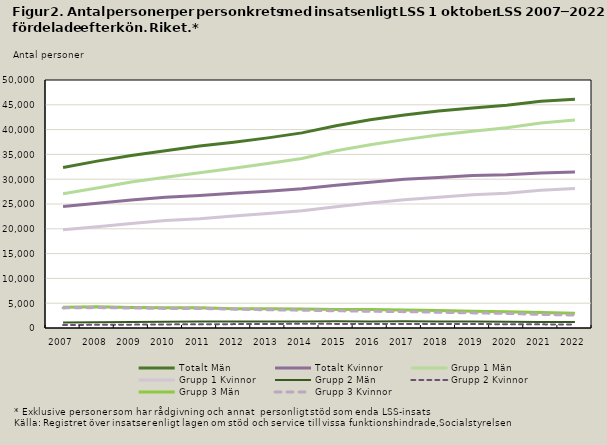
| Category | Totalt | Grupp 1 | Grupp 2 | Grupp 3 |
|---|---|---|---|---|
| 2007.0 | 24476 | 19820 | 603 | 4053 |
| 2008.0 | 25172 | 20414 | 640 | 4118 |
| 2009.0 | 25799 | 21087 | 676 | 4036 |
| 2010.0 | 26344 | 21671 | 725 | 3948 |
| 2011.0 | 26712 | 22023 | 747 | 3942 |
| 2012.0 | 27189 | 22599 | 782 | 3808 |
| 2013.0 | 27550 | 23072 | 814 | 3664 |
| 2014.0 | 28055 | 23618 | 847 | 3590 |
| 2015.0 | 28768 | 24461 | 831 | 3476 |
| 2016.0 | 29386 | 25183 | 830 | 3373 |
| 2017.0 | 29967 | 25846 | 825 | 3296 |
| 2018.0 | 30343 | 26368 | 802 | 3173 |
| 2019.0 | 30739 | 26887 | 802 | 3050 |
| 2020.0 | 30883 | 27186 | 761 | 2936 |
| 2021.0 | 31254 | 27772 | 734 | 2748 |
| 2022.0 | 31432 | 28109 | 707 | 2616 |